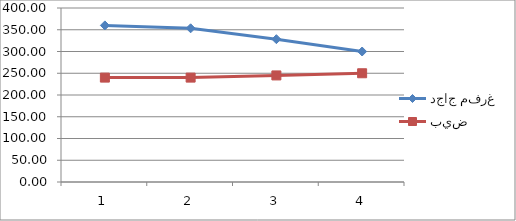
| Category | دجاج مفرغ | بيض |
|---|---|---|
| 0 | 360 | 240 |
| 1 | 353.333 | 240 |
| 2 | 328.333 | 245 |
| 3 | 300 | 250 |